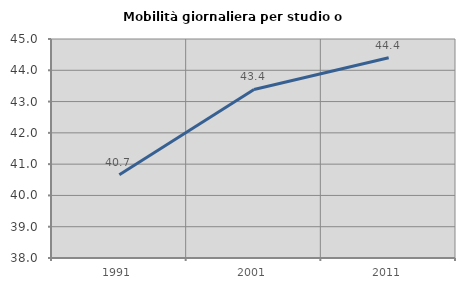
| Category | Mobilità giornaliera per studio o lavoro |
|---|---|
| 1991.0 | 40.659 |
| 2001.0 | 43.387 |
| 2011.0 | 44.402 |